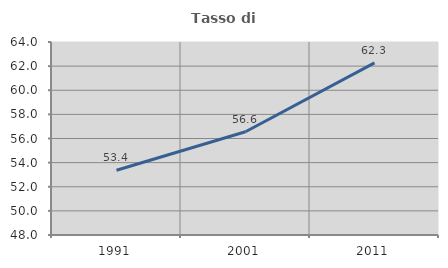
| Category | Tasso di occupazione   |
|---|---|
| 1991.0 | 53.371 |
| 2001.0 | 56.557 |
| 2011.0 | 62.268 |